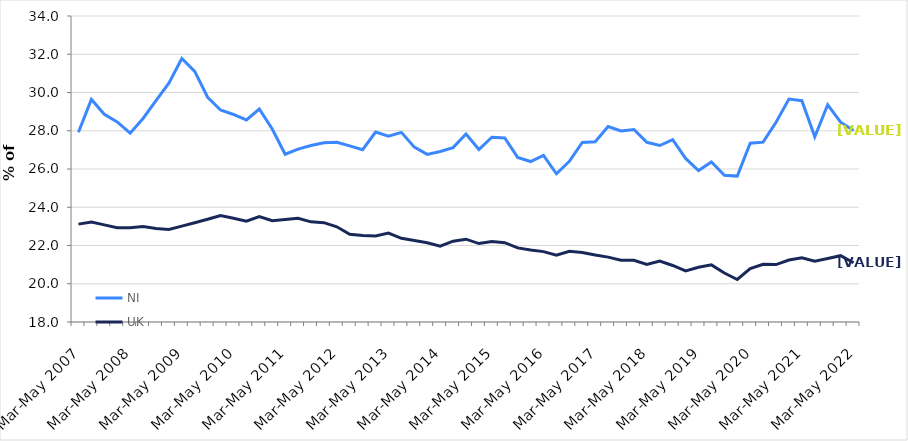
| Category | NI | UK |
|---|---|---|
| Mar-May 2007 | 27.923 | 23.117 |
| Jun-Aug 2007 | 29.639 | 23.233 |
| Sep-Nov 2007 | 28.863 | 23.08 |
| Dec-Feb 2008 | 28.464 | 22.927 |
| Mar-May 2008 | 27.876 | 22.927 |
| Jun-Aug 2008 | 28.643 | 22.988 |
| Sep-Nov 2008 | 29.57 | 22.895 |
| Dec-Feb 2009 | 30.485 | 22.838 |
| Mar-May 2009 | 31.781 | 23.012 |
| Jun-Aug 2009 | 31.102 | 23.19 |
| Sep-Nov 2009 | 29.75 | 23.371 |
| Dec-Feb 2010 | 29.087 | 23.57 |
| Mar-May 2010 | 28.851 | 23.429 |
| Jun-Aug 2010 | 28.566 | 23.27 |
| Sep-Nov 2010 | 29.138 | 23.518 |
| Dec-Feb 2011 | 28.094 | 23.297 |
| Mar-May 2011 | 26.772 | 23.362 |
| Jun-Aug 2011 | 27.037 | 23.423 |
| Sep-Nov 2011 | 27.228 | 23.236 |
| Dec-Feb 2012 | 27.371 | 23.194 |
| Mar-May 2012 | 27.398 | 22.98 |
| Jun-Aug 2012 | 27.21 | 22.589 |
| Sep-Nov 2012 | 27.009 | 22.519 |
| Dec-Feb 2013 | 27.931 | 22.499 |
| Mar-May 2013 | 27.714 | 22.65 |
| Jun-Aug 2013 | 27.917 | 22.378 |
| Sep-Nov 2013 | 27.144 | 22.258 |
| Dec-Feb 2014 | 26.764 | 22.147 |
| Mar-May 2014 | 26.916 | 21.969 |
| Jun-Aug 2014 | 27.117 | 22.224 |
| Sep-Nov 2014 | 27.83 | 22.331 |
| Dec-Feb 2015 | 27.019 | 22.102 |
| Mar-May 2015 | 27.663 | 22.208 |
| Jun-Aug 2015 | 27.627 | 22.147 |
| Sep-Nov 2015 | 26.607 | 21.876 |
| Dec-Feb 2016 | 26.39 | 21.762 |
| Mar-May 2016 | 26.717 | 21.68 |
| Jun-Aug 2016 | 25.75 | 21.489 |
| Sep-Nov 2016 | 26.398 | 21.696 |
| Dec-Feb 2017 | 27.386 | 21.639 |
| Mar-May 2017 | 27.429 | 21.505 |
| Jun-Aug 2017 | 28.219 | 21.393 |
| Sep-Nov 2017 | 27.989 | 21.226 |
| Dec-Feb 2018 | 28.064 | 21.23 |
| Mar-May 2018 | 27.395 | 21.007 |
| Jun-Aug 2018 | 27.227 | 21.183 |
| Sep-Nov 2018 | 27.537 | 20.956 |
| Dec-Feb 2019 | 26.552 | 20.67 |
| Mar-May 2019 | 25.916 | 20.862 |
| Jun-Aug 2019 | 26.366 | 20.988 |
| Sep-Nov 2019 | 25.673 | 20.563 |
| Dec-Feb 2020 | 25.628 | 20.223 |
| Mar-May 2020 | 27.351 | 20.789 |
| Jun-Aug 2020 | 27.403 | 21.015 |
| Sep-Nov 2020 | 28.448 | 21.001 |
| Dec-Feb 2021 | 29.658 | 21.241 |
| Mar-May 2021 | 29.571 | 21.361 |
| Jun-Aug 2021 | 27.681 | 21.184 |
| Sep-Nov 2021 | 29.357 | 21.322 |
| Dec-Feb 2022 | 28.449 | 21.467 |
| Mar-May 2022 | 28.019 | 21.097 |